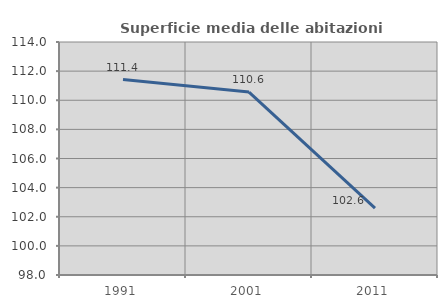
| Category | Superficie media delle abitazioni occupate |
|---|---|
| 1991.0 | 111.42 |
| 2001.0 | 110.561 |
| 2011.0 | 102.586 |